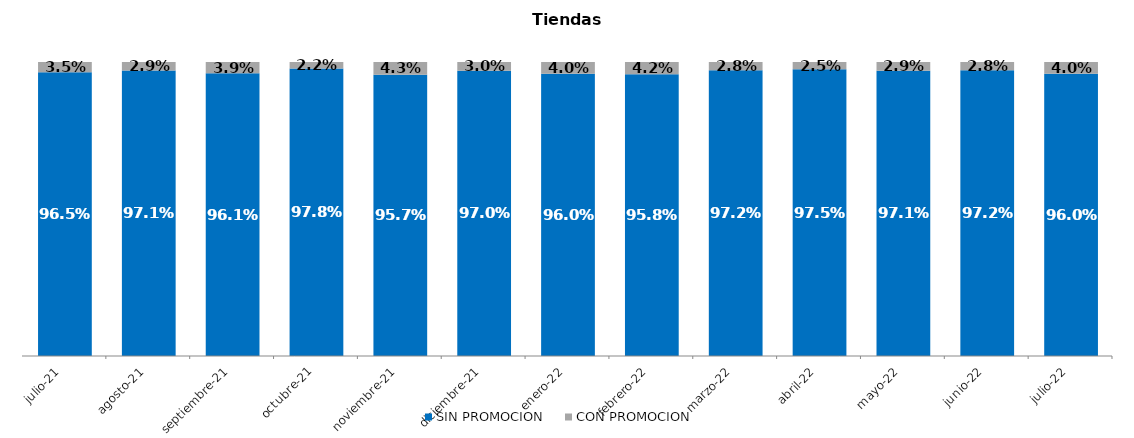
| Category | SIN PROMOCION   | CON PROMOCION   |
|---|---|---|
| 2021-07-01 | 0.965 | 0.035 |
| 2021-08-01 | 0.971 | 0.029 |
| 2021-09-01 | 0.961 | 0.039 |
| 2021-10-01 | 0.978 | 0.022 |
| 2021-11-01 | 0.957 | 0.043 |
| 2021-12-01 | 0.97 | 0.03 |
| 2022-01-01 | 0.96 | 0.04 |
| 2022-02-01 | 0.958 | 0.042 |
| 2022-03-01 | 0.972 | 0.028 |
| 2022-04-01 | 0.975 | 0.025 |
| 2022-05-01 | 0.971 | 0.029 |
| 2022-06-01 | 0.972 | 0.028 |
| 2022-07-01 | 0.96 | 0.04 |